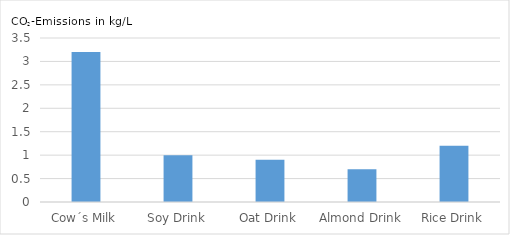
| Category | CO2-Emissions in kg/L |
|---|---|
| Cow´s Milk | 3.2 |
| Soy Drink | 1 |
| Oat Drink | 0.9 |
| Almond Drink | 0.7 |
| Rice Drink | 1.2 |